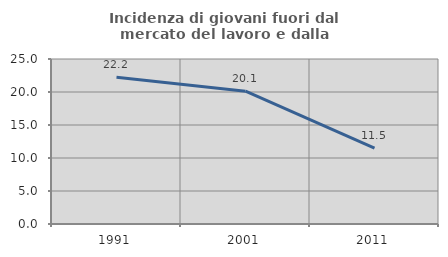
| Category | Incidenza di giovani fuori dal mercato del lavoro e dalla formazione  |
|---|---|
| 1991.0 | 22.24 |
| 2001.0 | 20.127 |
| 2011.0 | 11.491 |